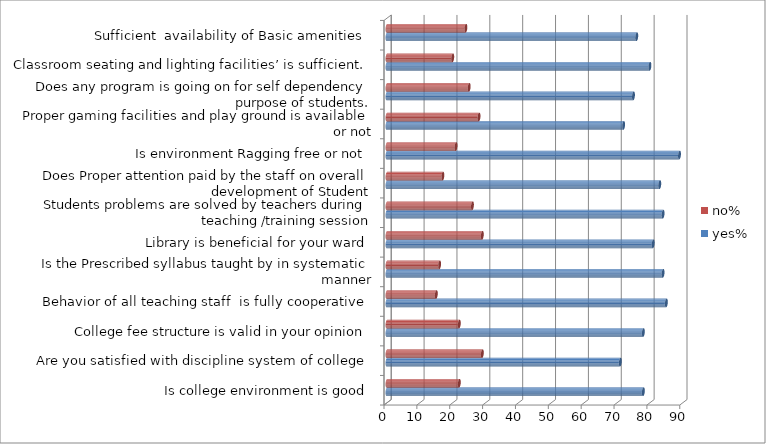
| Category | yes% | no% |
|---|---|---|
| Is college environment is good | 78 | 22 |
| Are you satisfied with discipline system of college | 71 | 29 |
| College fee structure is valid in your opinion | 78 | 22 |
| Behavior of all teaching staff  is fully cooperative | 85 | 15 |
| Is the Prescribed syllabus taught by in systematic manner | 84 | 16 |
| Library is beneficial for your ward | 81 | 29 |
| Students problems are solved by teachers during teaching /training session | 84 | 26 |
| Does Proper attention paid by the staff on overall development of Student | 83 | 17 |
| Is environment Ragging free or not | 89 | 21 |
| Proper gaming facilities and play ground is available or not | 72 | 28 |
| Does any program is going on for self dependency purpose of students. | 75 | 25 |
| Classroom seating and lighting facilities’ is sufficient. | 80 | 20 |
| Sufficient  availability of Basic amenities  | 76 | 24 |